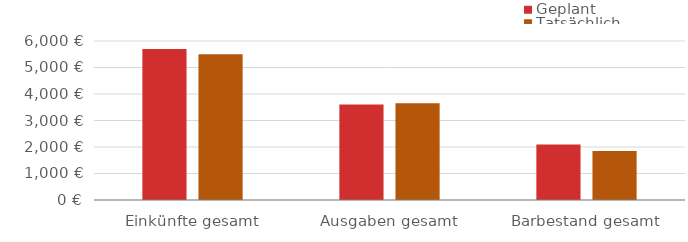
| Category | Geplant | Tatsächlich |
|---|---|---|
| Einkünfte gesamt | 5700 | 5500 |
| Ausgaben gesamt | 3603 | 3655 |
| Barbestand gesamt | 2097 | 1845 |